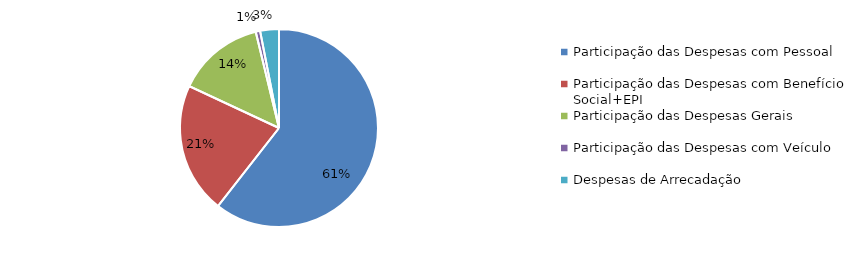
| Category | Series 0 |
|---|---|
| Participação das Despesas com Pessoal | 0.606 |
| Participação das Despesas com Benefício Social+EPI | 0.214 |
| Participação das Despesas Gerais | 0.143 |
| Participação das Despesas com Veículo | 0.007 |
| Despesas de Arrecadação | 0.031 |